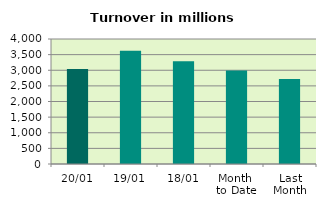
| Category | Series 0 |
|---|---|
| 20/01 | 3037.864 |
| 19/01 | 3626.869 |
| 18/01 | 3287.368 |
| Month 
to Date | 2988.611 |
| Last
Month | 2717.391 |